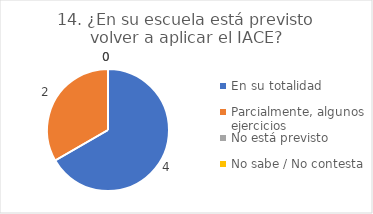
| Category | 14. ¿En su escuela está previsto volver a aplicar el IACE? |
|---|---|
| En su totalidad  | 0.667 |
| Parcialmente, algunos ejercicios  | 0.333 |
| No está previsto  | 0 |
| No sabe / No contesta | 0 |